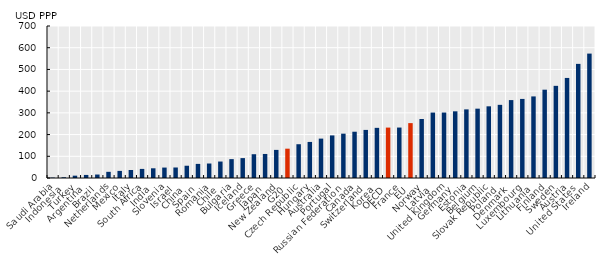
| Category | Per capita tax USDppp |
|---|---|
| Saudi Arabia | 1.93 |
| Indonesia | 3.4 |
| Turkey | 10.78 |
| Argentina | 14.129 |
| Brazil | 15.953 |
| Netherlands | 28.443 |
| Mexico | 32.701 |
| Italy | 36.984 |
| South Africa | 41.836 |
| India | 44.75 |
| Slovenia | 48.027 |
| Israel | 48.367 |
| China | 56.503 |
| Spain | 64.978 |
| Romania | 66.723 |
| Chile | 75.832 |
| Bulgaria | 86.908 |
| Iceland | 91.634 |
| Greece | 109.521 |
| Japan | 110.698 |
| New Zealand | 129.446 |
| G20 | 135.039 |
| Czech Republic | 155.566 |
| Hungary | 166.109 |
| Australia | 181.408 |
| Portugal | 196.118 |
| Russian Federation | 204.191 |
| Canada | 213.107 |
| Switzerland | 221.466 |
| Korea | 230.955 |
| OECD | 232.152 |
| France | 232.33 |
| EU | 252.749 |
| Norway | 271.719 |
| Latvia | 301.313 |
| United Kingdom | 301.442 |
| Germany | 307.074 |
| Estonia | 316.029 |
| Belgium | 319.301 |
| Slovak Republic | 330.112 |
| Poland | 336.921 |
| Denmark | 358.8 |
| Luxembourg | 364.157 |
| Lithuania | 375.719 |
| Finland | 406.685 |
| Sweden | 424.414 |
| Austria | 460.802 |
| United States | 525.566 |
| Ireland | 572.939 |